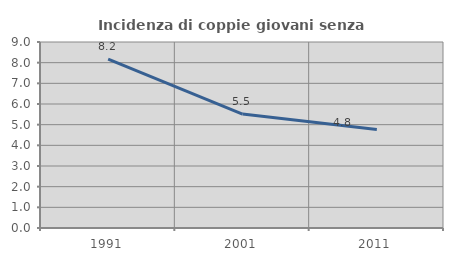
| Category | Incidenza di coppie giovani senza figli |
|---|---|
| 1991.0 | 8.167 |
| 2001.0 | 5.512 |
| 2011.0 | 4.762 |